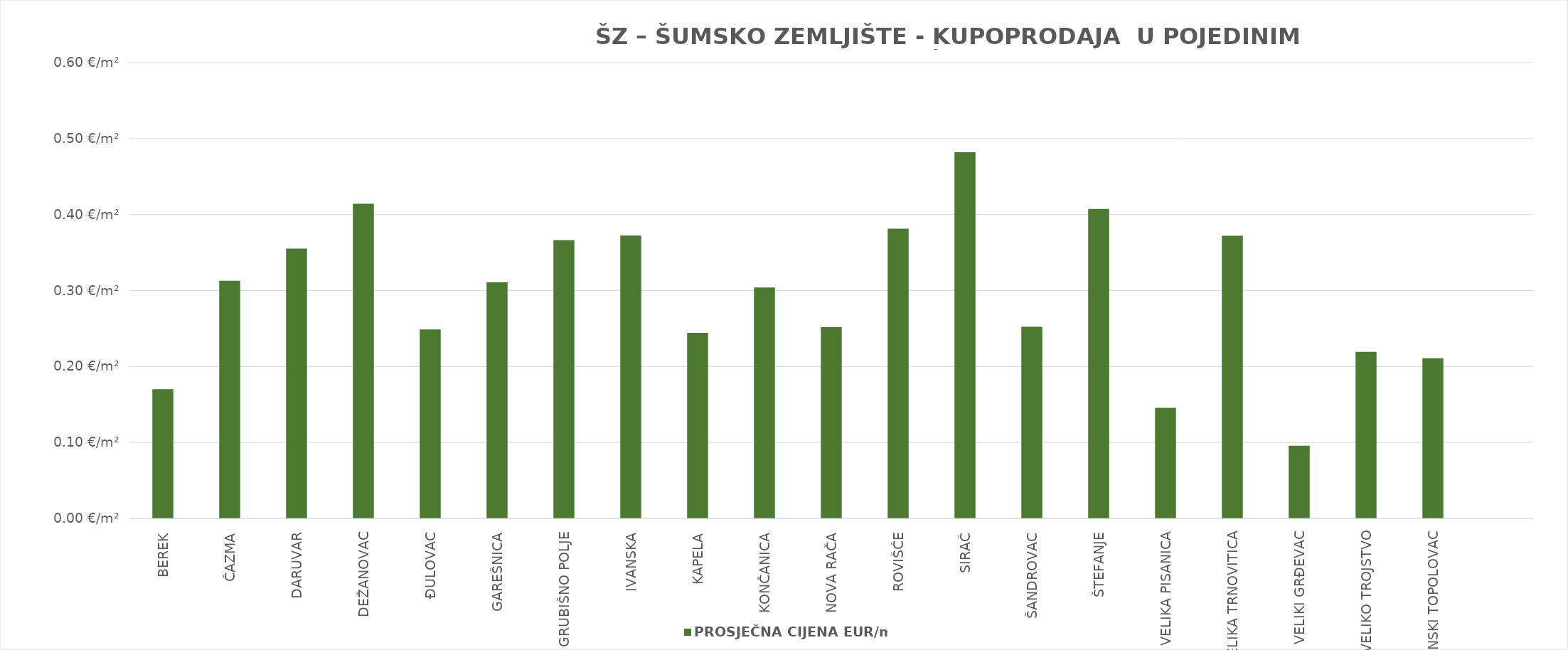
| Category | PROSJEČNA CIJENA EUR/m2 |
|---|---|
| BEREK | 0.17 |
| ČAZMA | 0.313 |
| DARUVAR | 0.355 |
| DEŽANOVAC | 0.414 |
| ĐULOVAC | 0.249 |
| GAREŠNICA | 0.311 |
| GRUBIŠNO POLJE | 0.366 |
| IVANSKA | 0.372 |
| KAPELA | 0.244 |
| KONČANICA | 0.304 |
| NOVA RAČA | 0.252 |
| ROVIŠĆE | 0.381 |
| SIRAČ | 0.482 |
| ŠANDROVAC | 0.252 |
| ŠTEFANJE | 0.407 |
| VELIKA PISANICA | 0.146 |
| VELIKA TRNOVITICA | 0.372 |
| VELIKI GRĐEVAC | 0.096 |
| VELIKO TROJSTVO | 0.219 |
| ZRINSKI TOPOLOVAC | 0.211 |